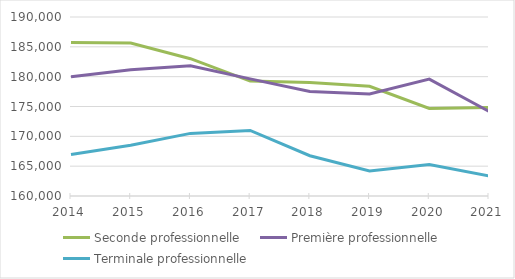
| Category | Seconde professionnelle | Première professionnelle | Terminale professionnelle |
|---|---|---|---|
| 2014.0 | 185725 | 179992 | 166965 |
| 2015.0 | 185641 | 181172 | 168520 |
| 2016.0 | 183014 | 181821 | 170495 |
| 2017.0 | 179261 | 179625 | 170981 |
| 2018.0 | 179002 | 177529 | 166749 |
| 2019.0 | 178398 | 177099 | 164195 |
| 2020.0 | 174667 | 179596 | 165285 |
| 2021.0 | 174850 | 174170 | 163367 |